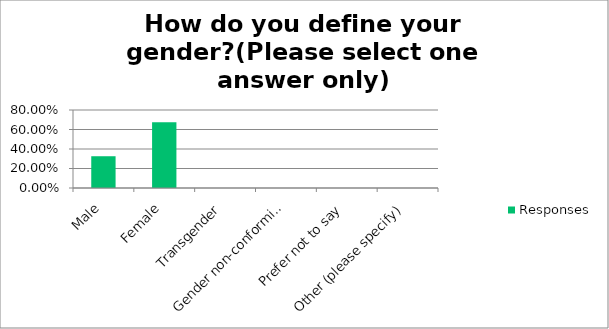
| Category | Responses |
|---|---|
| Male | 0.326 |
| Female | 0.674 |
| Transgender | 0 |
| Gender non-conforming | 0 |
| Prefer not to say | 0 |
| Other (please specify) | 0 |